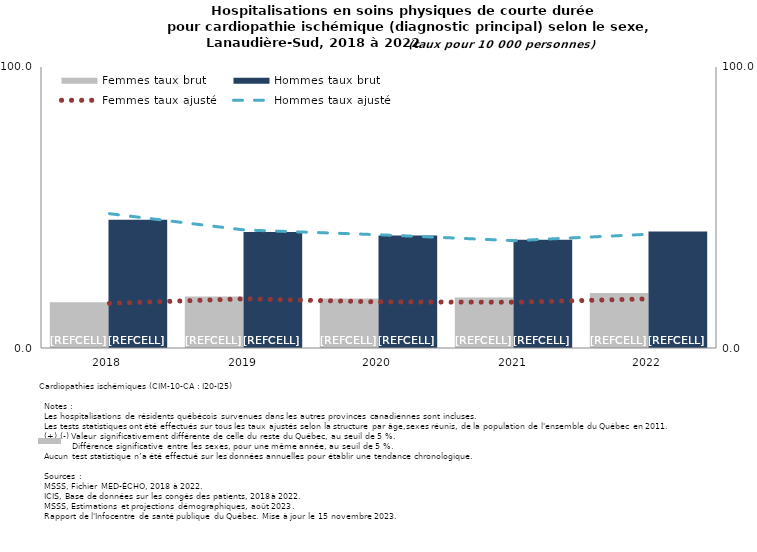
| Category | Femmes taux brut | Hommes taux brut |
|---|---|---|
| 2018.0 | 16.3 | 45.6 |
| 2019.0 | 18.3 | 41.3 |
| 2020.0 | 17.6 | 40 |
| 2021.0 | 18 | 38.5 |
| 2022.0 | 19.6 | 41.5 |